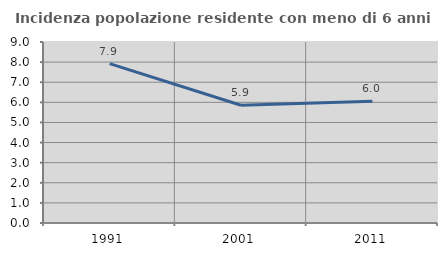
| Category | Incidenza popolazione residente con meno di 6 anni |
|---|---|
| 1991.0 | 7.927 |
| 2001.0 | 5.856 |
| 2011.0 | 6.05 |